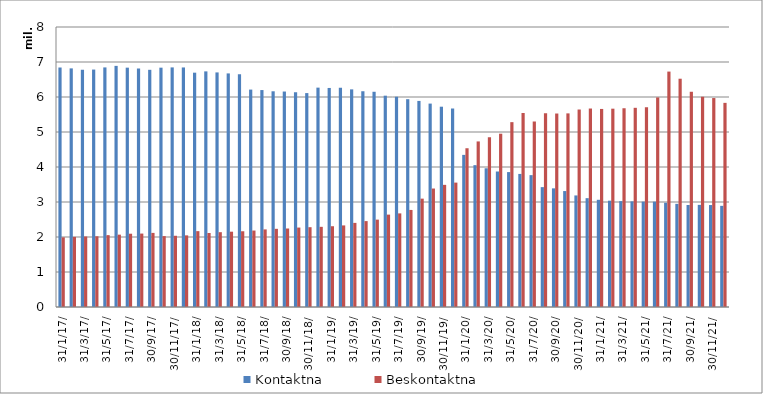
| Category | Kontaktna | Beskontaktna |
|---|---|---|
| 2017-01-31 | 6842786 | 1990487 |
| 2017-02-28 | 6817679 | 2002822 |
| 2017-03-31 | 6780498 | 2014680 |
| 2017-04-30 | 6783872 | 2020822 |
| 2017-05-31 | 6845404 | 2053495 |
| 2017-06-30 | 6889221 | 2067311 |
| 2017-07-31 | 6838214 | 2093973 |
| 2017-08-31 | 6815969 | 2098074 |
| 2017-09-30 | 6776918 | 2117254 |
| 2017-10-31 | 6838182 | 2025505 |
| 2017-11-30 | 6845606 | 2035069 |
| 2017-12-31 | 6844238 | 2046570 |
| 2018-01-31 | 6695011 | 2167243 |
| 2018-02-28 | 6732191 | 2115009 |
| 2018-03-31 | 6702220 | 2137473 |
| 2018-04-30 | 6673960 | 2151788 |
| 2018-05-31 | 6646978 | 2164164 |
| 2018-06-30 | 6211852 | 2184523 |
| 2018-07-31 | 6198227 | 2216763 |
| 2018-08-31 | 6163335 | 2233398 |
| 2018-09-30 | 6156227 | 2242857 |
| 2018-10-31 | 6138561 | 2269603 |
| 2018-11-30 | 6111801 | 2280333 |
| 2018-12-31 | 6267590 | 2290475 |
| 2019-01-31 | 6258361 | 2307838 |
| 2019-02-28 | 6262083 | 2331039 |
| 2019-03-31 | 6218082 | 2403112 |
| 2019-04-30 | 6164493 | 2454122 |
| 2019-05-31 | 6149460 | 2496287 |
| 2019-06-30 | 6037684 | 2639589 |
| 2019-07-31 | 6006840 | 2674818 |
| 2019-08-31 | 5937719 | 2773117 |
| 2019-09-30 | 5887780 | 3095912 |
| 2019-10-31 | 5811685 | 3384890 |
| 2019-11-30 | 5723018 | 3489993 |
| 2019-12-31 | 5670701 | 3554151 |
| 2020-01-31 | 4346407 | 4535875 |
| 2020-02-29 | 4052838 | 4730560 |
| 2020-03-31 | 3963662 | 4847816 |
| 2020-04-30 | 3871261 | 4951259 |
| 2020-05-31 | 3854633 | 5281387 |
| 2020-06-30 | 3802061 | 5542911 |
| 2020-07-31 | 3767638 | 5299995 |
| 2020-08-31 | 3424948 | 5532239 |
| 2020-09-30 | 3389747 | 5528024 |
| 2020-10-31 | 3312651 | 5532192 |
| 2020-11-30 | 3187440 | 5642453 |
| 2020-12-31 | 3109660 | 5670596 |
| 2021-01-31 | 3063101 | 5658757 |
| 2021-02-28 | 3037701 | 5666306 |
| 2021-03-31 | 3025208 | 5678726 |
| 2021-04-30 | 3017989 | 5690982 |
| 2021-05-31 | 3010172 | 5704332 |
| 2021-06-30 | 3009412 | 5987752 |
| 2021-07-31 | 2978761 | 6726405 |
| 2021-08-31 | 2947428 | 6522269 |
| 2021-09-30 | 2914976 | 6149620 |
| 2021-10-31 | 2918002 | 6004325 |
| 2021-11-30 | 2913089 | 5970213 |
| 2021-12-31 | 2890160 | 5832567 |